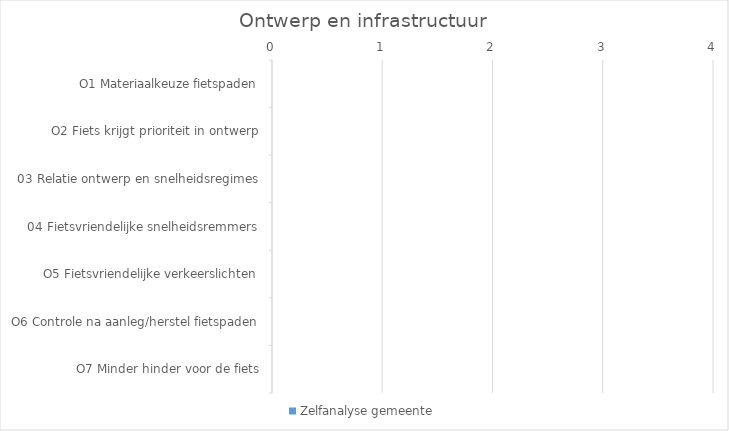
| Category | Zelfanalyse gemeente |
|---|---|
| O1 Materiaalkeuze fietspaden | 0 |
| O2 Fiets krijgt prioriteit in ontwerp | 0 |
| 03 Relatie ontwerp en snelheidsregimes | 0 |
| 04 Fietsvriendelijke snelheidsremmers | 0 |
| O5 Fietsvriendelijke verkeerslichten | 0 |
| O6 Controle na aanleg/herstel fietspaden | 0 |
| O7 Minder hinder voor de fiets | 0 |